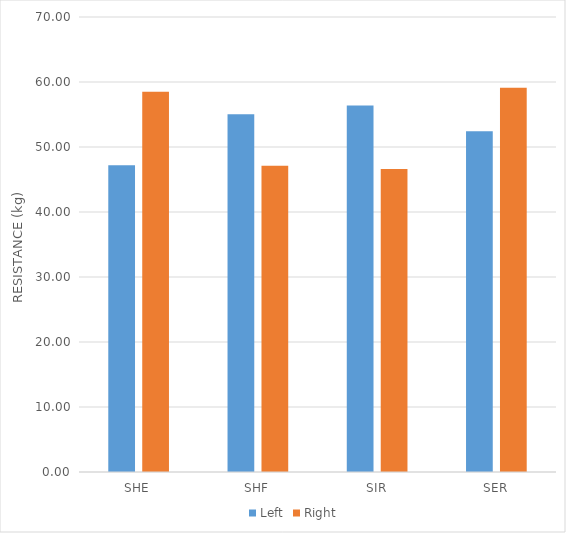
| Category | Left | Right |
|---|---|---|
| SHE | 47.2 | 58.49 |
| SHF | 55.02 | 47.1 |
| SIR | 56.39 | 46.61 |
| SER | 52.43 | 59.12 |